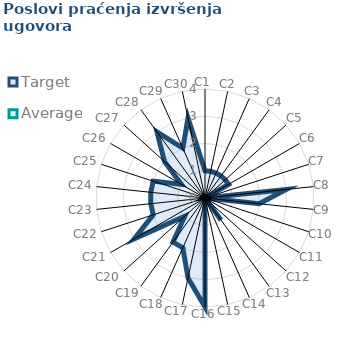
| Category | Target | Average |
|---|---|---|
| C1 | 1 | 0 |
| C2 | 1 | 0 |
| C3 | 1 | 0 |
| C4 | 1 | 0 |
| C5 | 1 | 0 |
| C6 | 1 | 0 |
| C7 | 0 | 0 |
| C8 | 3 | 0 |
| C9 | 2 | 0 |
| C10 | 0 | 0 |
| C11 | 0 | 0 |
| C12 | 0 | 0 |
| C13 | 1 | 0 |
| C14 | 0 | 0 |
| C15 | 0 | 0 |
| C16 | 4 | 0 |
| C17 | 3 | 0 |
| C18 | 2 | 0 |
| C19 | 2 | 0 |
| C20 | 1 | 0 |
| C21 | 3 | 0 |
| C22 | 2 | 0 |
| C23 | 2 | 0 |
| C24 | 2 | 0 |
| C25 | 2 | 0 |
| C26 | 1 | 0 |
| C27 | 2 | 0 |
| C28 | 3 | 0 |
| C29 | 2 | 0 |
| C30 | 3 | 0 |